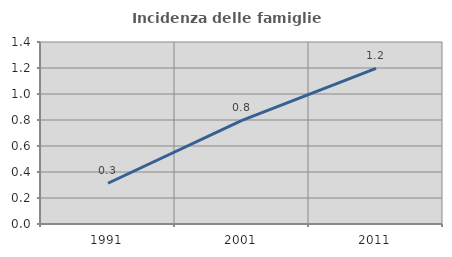
| Category | Incidenza delle famiglie numerose |
|---|---|
| 1991.0 | 0.313 |
| 2001.0 | 0.798 |
| 2011.0 | 1.198 |